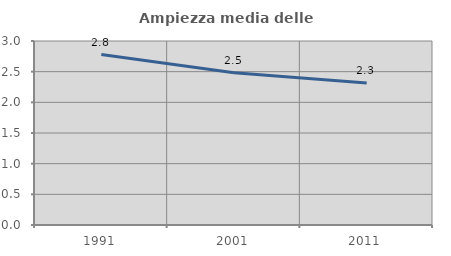
| Category | Ampiezza media delle famiglie |
|---|---|
| 1991.0 | 2.779 |
| 2001.0 | 2.481 |
| 2011.0 | 2.313 |